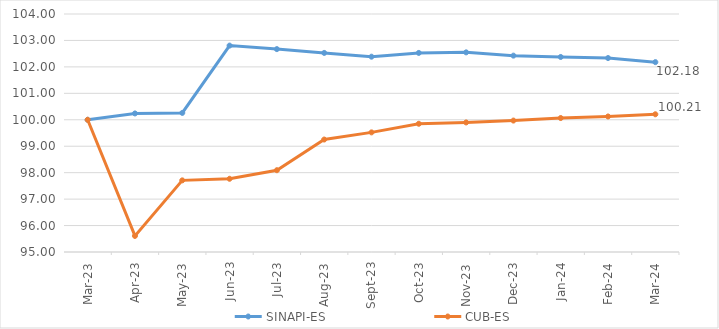
| Category | SINAPI-ES | CUB-ES |
|---|---|---|
| 2023-03-01 | 100 | 100 |
| 2023-04-01 | 100.24 | 95.608 |
| 2023-05-01 | 100.26 | 97.709 |
| 2023-06-01 | 102.806 | 97.769 |
| 2023-07-01 | 102.672 | 98.093 |
| 2023-08-01 | 102.528 | 99.253 |
| 2023-09-01 | 102.386 | 99.523 |
| 2023-10-01 | 102.528 | 99.849 |
| 2023-11-01 | 102.549 | 99.899 |
| 2023-12-01 | 102.426 | 99.97 |
| 2024-01-01 | 102.375 | 100.066 |
| 2024-02-01 | 102.334 | 100.125 |
| 2024-03-01 | 102.18 | 100.208 |